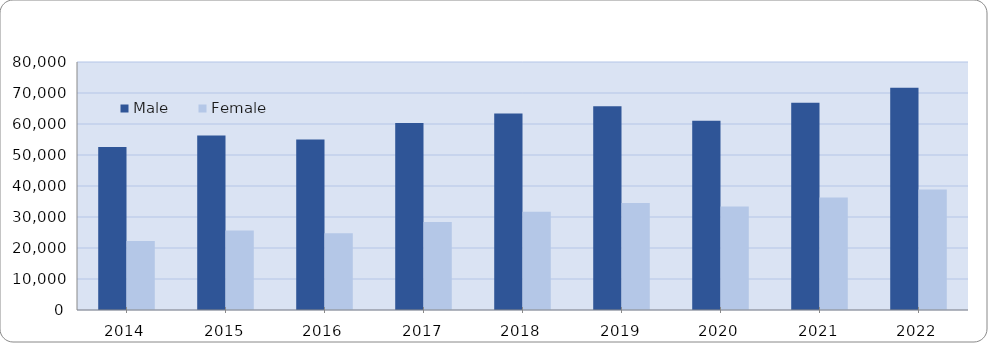
| Category | Male | Female |
|---|---|---|
| 2014.0 | 52562 | 22287 |
| 2015.0 | 56251 | 25671 |
| 2016.0 | 54979 | 24750 |
| 2017.0 | 60340 | 28376 |
| 2018.0 | 63354 | 31733 |
| 2019.0 | 65713 | 34512 |
| 2020.0 | 61044 | 33414 |
| 2021.0 | 66828 | 36315 |
| 2022.0 | 71673 | 38911 |